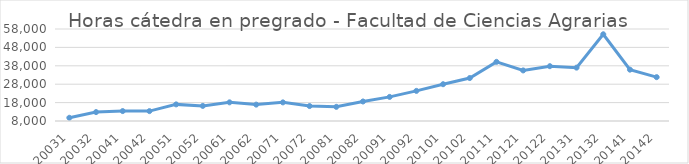
| Category | Total horas |
|---|---|
| 20031 | 9754 |
| 20032 | 12845 |
| 20041 | 13390 |
| 20042 | 13371 |
| 20051 | 17031 |
| 20052 | 16205 |
| 20061 | 18137 |
| 20062 | 16903 |
| 20071 | 18120 |
| 20072 | 16119 |
| 20081 | 15696 |
| 20082 | 18603 |
| 20091 | 21100 |
| 20092 | 24366 |
| 20101 | 27993 |
| 20102 | 31341 |
| 20111 | 40144 |
| 20121 | 35488 |
| 20122 | 37795 |
| 20131 | 37005 |
| 20132 | 55133 |
| 20141 | 35906 |
| 20142 | 31828 |